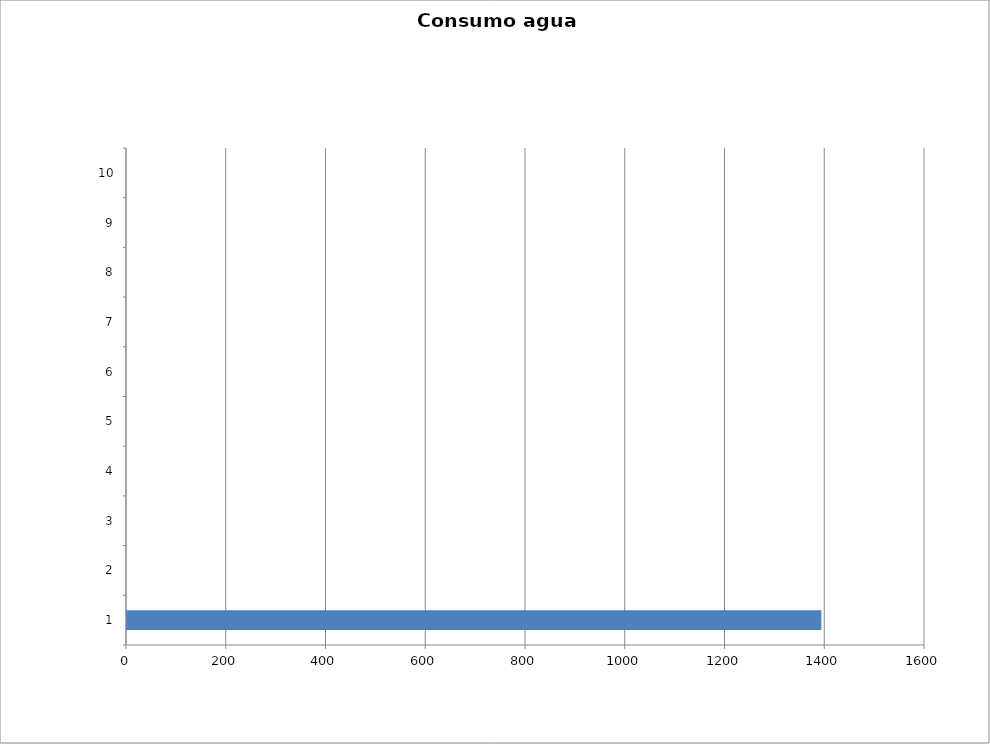
| Category | Series 0 |
|---|---|
| 0 | 1392.25 |
| 1 | 0 |
| 2 | 0 |
| 3 | 0 |
| 4 | 0 |
| 5 | 0 |
| 6 | 0 |
| 7 | 0 |
| 8 | 0 |
| 9 | 0 |